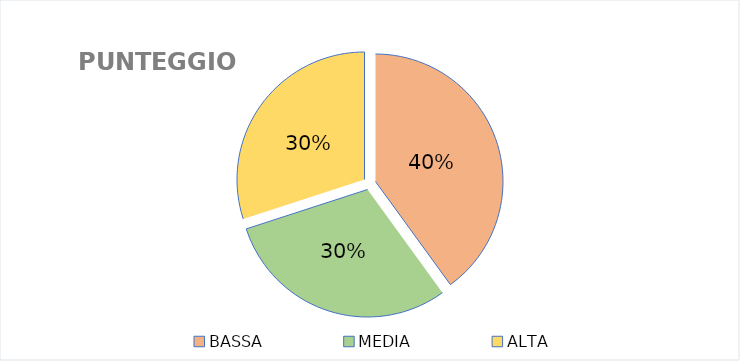
| Category | Series 0 |
|---|---|
| BASSA | 4 |
| MEDIA | 3 |
| ALTA | 3 |